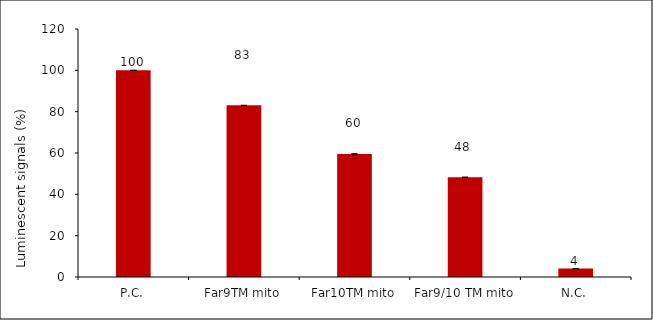
| Category | Series 0 |
|---|---|
| P.C. | 100 |
| Far9TM mito | 83.047 |
| Far10TM mito | 59.564 |
| Far9/10 TM mito | 48.272 |
| N.C. | 4.055 |